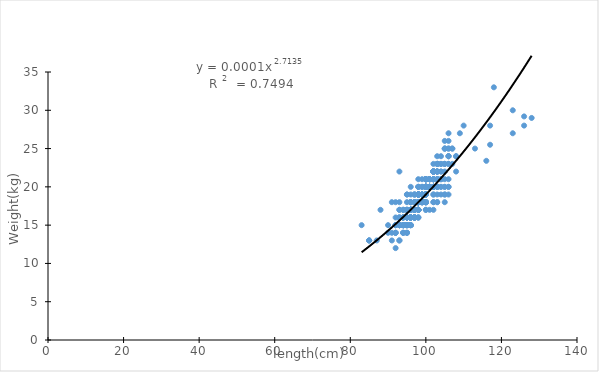
| Category | Series 0 |
|---|---|
| 92.0 | 12 |
| 91.0 | 13 |
| 93.0 | 13 |
| 87.0 | 13 |
| 85.0 | 13 |
| 85.0 | 13 |
| 85.0 | 13 |
| 93.0 | 13 |
| 91.0 | 14 |
| 92.0 | 14 |
| 90.0 | 14 |
| 92.0 | 14 |
| 92.0 | 14 |
| 94.0 | 14 |
| 95.0 | 14 |
| 95.0 | 14 |
| 94.0 | 14 |
| 95.0 | 14 |
| 94.0 | 14 |
| 83.0 | 15 |
| 93.0 | 15 |
| 95.0 | 15 |
| 95.0 | 15 |
| 94.0 | 15 |
| 96.0 | 15 |
| 96.0 | 15 |
| 94.0 | 15 |
| 93.0 | 15 |
| 92.0 | 15 |
| 90.0 | 15 |
| 93.0 | 15 |
| 92.0 | 15 |
| 93.0 | 15 |
| 94.0 | 15 |
| 96.0 | 15 |
| 93.0 | 15 |
| 93.0 | 15 |
| 92.0 | 15 |
| 94.0 | 15 |
| 93.0 | 15 |
| 93.0 | 15 |
| 94.0 | 15 |
| 92.0 | 15 |
| 94.0 | 15 |
| 95.0 | 15 |
| 94.0 | 15 |
| 94.0 | 15 |
| 94.0 | 15 |
| 96.0 | 15 |
| 95.0 | 15 |
| 95.0 | 15 |
| 95.0 | 15 |
| 96.0 | 15 |
| 95.0 | 15 |
| 94.0 | 15 |
| 95.0 | 15 |
| 95.0 | 15 |
| 94.0 | 15 |
| 96.0 | 15 |
| 95.0 | 15 |
| 95.0 | 15 |
| 95.0 | 15 |
| 94.0 | 15 |
| 94.0 | 15 |
| 95.0 | 15 |
| 95.0 | 15 |
| 97.0 | 16 |
| 98.0 | 16 |
| 92.0 | 16 |
| 94.0 | 16 |
| 96.0 | 16 |
| 94.0 | 16 |
| 95.0 | 16 |
| 93.0 | 16 |
| 93.0 | 16 |
| 98.0 | 16 |
| 94.0 | 16 |
| 95.0 | 16 |
| 93.0 | 16 |
| 96.0 | 16 |
| 97.0 | 16 |
| 95.0 | 16 |
| 94.0 | 16 |
| 97.0 | 16 |
| 94.0 | 16 |
| 97.0 | 16 |
| 96.0 | 16 |
| 97.0 | 16 |
| 96.0 | 16 |
| 95.0 | 16 |
| 98.0 | 16 |
| 96.0 | 16 |
| 95.0 | 16 |
| 95.0 | 16 |
| 96.0 | 16 |
| 97.0 | 16 |
| 96.0 | 16 |
| 94.0 | 16 |
| 95.0 | 16 |
| 96.0 | 16 |
| 96.0 | 16 |
| 95.0 | 16 |
| 97.0 | 16 |
| 96.0 | 16 |
| 96.0 | 16 |
| 96.0 | 16 |
| 95.0 | 16 |
| 96.0 | 16 |
| 96.0 | 16 |
| 97.0 | 16 |
| 96.0 | 16 |
| 96.0 | 16 |
| 96.0 | 16 |
| 95.0 | 16 |
| 96.0 | 16 |
| 96.0 | 16 |
| 88.0 | 17 |
| 98.0 | 17 |
| 100.0 | 17 |
| 98.0 | 17 |
| 96.0 | 17 |
| 98.0 | 17 |
| 97.0 | 17 |
| 93.0 | 17 |
| 97.0 | 17 |
| 94.0 | 17 |
| 95.0 | 17 |
| 95.0 | 17 |
| 98.0 | 17 |
| 96.0 | 17 |
| 100.0 | 17 |
| 97.0 | 17 |
| 98.0 | 17 |
| 101.0 | 17 |
| 102.0 | 17 |
| 98.0 | 17 |
| 94.0 | 17 |
| 95.0 | 17 |
| 94.0 | 17 |
| 93.0 | 17 |
| 98.0 | 17 |
| 96.0 | 17 |
| 97.0 | 17 |
| 97.0 | 17 |
| 97.0 | 17 |
| 96.0 | 17 |
| 96.0 | 17 |
| 97.0 | 17 |
| 96.0 | 17 |
| 95.0 | 17 |
| 98.0 | 17 |
| 97.0 | 17 |
| 98.0 | 17 |
| 97.0 | 17 |
| 98.0 | 17 |
| 96.0 | 17 |
| 96.0 | 17 |
| 97.0 | 17 |
| 97.0 | 17 |
| 97.0 | 17 |
| 97.0 | 17 |
| 96.0 | 17 |
| 97.0 | 17 |
| 96.0 | 17 |
| 97.0 | 17 |
| 96.0 | 17 |
| 97.0 | 17 |
| 97.0 | 17 |
| 96.0 | 17 |
| 95.0 | 17 |
| 96.0 | 17 |
| 95.0 | 17 |
| 98.0 | 17 |
| 96.0 | 17 |
| 97.0 | 17 |
| 96.0 | 17 |
| 96.0 | 17 |
| 97.0 | 17 |
| 97.0 | 17 |
| 98.0 | 17 |
| 96.0 | 17 |
| 97.0 | 17 |
| 98.0 | 17 |
| 96.0 | 17 |
| 97.0 | 17 |
| 97.0 | 17 |
| 97.0 | 17 |
| 96.0 | 17 |
| 97.0 | 17 |
| 96.0 | 17 |
| 98.0 | 17 |
| 97.0 | 17 |
| 97.0 | 17 |
| 97.0 | 17 |
| 97.0 | 17 |
| 97.0 | 17 |
| 96.0 | 17 |
| 96.0 | 17 |
| 97.0 | 17 |
| 97.0 | 18 |
| 91.0 | 18 |
| 102.0 | 18 |
| 100.0 | 18 |
| 100.0 | 18 |
| 97.0 | 18 |
| 96.0 | 18 |
| 100.0 | 18 |
| 100.0 | 18 |
| 98.0 | 18 |
| 92.0 | 18 |
| 98.0 | 18 |
| 102.0 | 18 |
| 100.0 | 18 |
| 98.0 | 18 |
| 103.0 | 18 |
| 105.0 | 18 |
| 97.0 | 18 |
| 98.0 | 18 |
| 100.0 | 18 |
| 103.0 | 18 |
| 95.0 | 18 |
| 100.0 | 18 |
| 98.0 | 18 |
| 96.0 | 18 |
| 93.0 | 18 |
| 96.0 | 18 |
| 97.0 | 18 |
| 100.0 | 18 |
| 98.0 | 18 |
| 99.0 | 18 |
| 100.0 | 18 |
| 100.0 | 18 |
| 99.0 | 18 |
| 100.0 | 18 |
| 98.0 | 18 |
| 99.0 | 18 |
| 98.0 | 18 |
| 98.0 | 18 |
| 98.0 | 18 |
| 99.0 | 18 |
| 99.0 | 18 |
| 98.0 | 18 |
| 98.0 | 18 |
| 99.0 | 18 |
| 98.0 | 18 |
| 99.0 | 18 |
| 98.0 | 18 |
| 98.0 | 18 |
| 99.0 | 18 |
| 98.0 | 18 |
| 98.0 | 18 |
| 97.0 | 18 |
| 98.0 | 18 |
| 98.0 | 18 |
| 98.0 | 18 |
| 97.0 | 18 |
| 96.0 | 18 |
| 97.0 | 18 |
| 98.0 | 18 |
| 98.0 | 18 |
| 99.0 | 18 |
| 99.0 | 18 |
| 98.0 | 18 |
| 98.0 | 18 |
| 99.0 | 18 |
| 98.0 | 18 |
| 98.0 | 18 |
| 98.0 | 18 |
| 98.0 | 18 |
| 98.0 | 18 |
| 99.0 | 18 |
| 97.0 | 18 |
| 98.0 | 18 |
| 98.0 | 18 |
| 98.0 | 18 |
| 98.0 | 18 |
| 98.0 | 18 |
| 99.0 | 18 |
| 97.0 | 18 |
| 98.0 | 18 |
| 97.0 | 18 |
| 98.0 | 18 |
| 98.0 | 18 |
| 98.0 | 18 |
| 98.0 | 18 |
| 98.0 | 18 |
| 102.0 | 19 |
| 105.0 | 19 |
| 100.0 | 19 |
| 100.0 | 19 |
| 98.0 | 19 |
| 96.0 | 19 |
| 104.0 | 19 |
| 100.0 | 19 |
| 106.0 | 19 |
| 98.0 | 19 |
| 100.0 | 19 |
| 102.0 | 19 |
| 105.0 | 19 |
| 100.0 | 19 |
| 98.0 | 19 |
| 103.0 | 19 |
| 98.0 | 19 |
| 95.0 | 19 |
| 95.0 | 19 |
| 97.0 | 19 |
| 97.0 | 19 |
| 97.0 | 19 |
| 100.0 | 19 |
| 100.0 | 19 |
| 100.0 | 19 |
| 100.0 | 19 |
| 98.0 | 19 |
| 100.0 | 19 |
| 100.0 | 19 |
| 100.0 | 19 |
| 100.0 | 19 |
| 100.0 | 19 |
| 100.0 | 19 |
| 98.0 | 19 |
| 100.0 | 19 |
| 99.0 | 19 |
| 98.0 | 19 |
| 99.0 | 19 |
| 98.0 | 19 |
| 100.0 | 19 |
| 98.0 | 19 |
| 98.0 | 19 |
| 99.0 | 19 |
| 99.0 | 19 |
| 99.0 | 19 |
| 98.0 | 19 |
| 98.0 | 19 |
| 99.0 | 19 |
| 100.0 | 19 |
| 100.0 | 19 |
| 100.0 | 19 |
| 100.0 | 19 |
| 100.0 | 19 |
| 99.0 | 19 |
| 100.0 | 19 |
| 100.0 | 19 |
| 100.0 | 19 |
| 100.0 | 19 |
| 100.0 | 19 |
| 100.0 | 19 |
| 99.0 | 19 |
| 99.0 | 19 |
| 98.0 | 19 |
| 98.0 | 19 |
| 99.0 | 19 |
| 98.0 | 19 |
| 99.0 | 19 |
| 103.0 | 20 |
| 100.0 | 20 |
| 106.0 | 20 |
| 102.0 | 20 |
| 104.0 | 20 |
| 100.0 | 20 |
| 102.0 | 20 |
| 96.0 | 20 |
| 98.0 | 20 |
| 105.0 | 20 |
| 101.0 | 20 |
| 102.0 | 20 |
| 106.0 | 20 |
| 100.0 | 20 |
| 101.0 | 20 |
| 105.0 | 20 |
| 103.0 | 20 |
| 101.0 | 20 |
| 100.0 | 20 |
| 98.0 | 20 |
| 102.0 | 20 |
| 98.0 | 20 |
| 101.0 | 20 |
| 104.0 | 20 |
| 100.0 | 20 |
| 102.0 | 20 |
| 103.0 | 20 |
| 102.0 | 20 |
| 102.0 | 20 |
| 102.0 | 20 |
| 101.0 | 20 |
| 100.0 | 20 |
| 102.0 | 20 |
| 103.0 | 20 |
| 100.0 | 20 |
| 99.0 | 20 |
| 100.0 | 20 |
| 99.0 | 20 |
| 100.0 | 20 |
| 100.0 | 20 |
| 100.0 | 20 |
| 101.0 | 20 |
| 100.0 | 20 |
| 100.0 | 20 |
| 100.0 | 20 |
| 101.0 | 20 |
| 100.0 | 20 |
| 100.0 | 20 |
| 101.0 | 20 |
| 100.0 | 20 |
| 101.0 | 20 |
| 100.0 | 20 |
| 100.0 | 20 |
| 100.0 | 20 |
| 102.0 | 20 |
| 100.0 | 20 |
| 100.0 | 20 |
| 100.0 | 20 |
| 101.0 | 20 |
| 100.0 | 20 |
| 101.0 | 20 |
| 99.0 | 20 |
| 100.0 | 20 |
| 100.0 | 20 |
| 100.0 | 20 |
| 100.0 | 20 |
| 99.0 | 21 |
| 98.0 | 21 |
| 104.0 | 21 |
| 106.0 | 21 |
| 100.0 | 21 |
| 103.0 | 21 |
| 104.0 | 21 |
| 100.0 | 21 |
| 102.0 | 21 |
| 100.0 | 21 |
| 102.0 | 21 |
| 100.0 | 21 |
| 100.0 | 21 |
| 100.0 | 21 |
| 100.0 | 21 |
| 102.0 | 21 |
| 105.0 | 21 |
| 103.0 | 21 |
| 102.0 | 21 |
| 100.0 | 21 |
| 104.0 | 21 |
| 103.0 | 21 |
| 102.0 | 21 |
| 103.0 | 21 |
| 103.0 | 21 |
| 102.0 | 21 |
| 103.0 | 21 |
| 102.0 | 21 |
| 101.0 | 21 |
| 100.0 | 21 |
| 101.0 | 21 |
| 101.0 | 21 |
| 102.0 | 21 |
| 101.0 | 21 |
| 102.0 | 21 |
| 101.0 | 21 |
| 101.0 | 21 |
| 102.0 | 21 |
| 100.0 | 21 |
| 100.0 | 21 |
| 101.0 | 21 |
| 101.0 | 21 |
| 100.0 | 21 |
| 93.0 | 22 |
| 108.0 | 22 |
| 104.0 | 22 |
| 102.0 | 22 |
| 103.0 | 22 |
| 103.0 | 22 |
| 104.0 | 22 |
| 102.0 | 22 |
| 105.0 | 22 |
| 103.0 | 22 |
| 103.0 | 22 |
| 103.0 | 22 |
| 102.0 | 22 |
| 102.0 | 22 |
| 103.0 | 22 |
| 102.0 | 22 |
| 102.0 | 22 |
| 102.0 | 22 |
| 102.0 | 22 |
| 102.0 | 22 |
| 102.0 | 22 |
| 102.0 | 22 |
| 105.0 | 23 |
| 106.0 | 23 |
| 105.0 | 23 |
| 104.0 | 23 |
| 102.0 | 23 |
| 105.0 | 23 |
| 103.0 | 23 |
| 106.0 | 23 |
| 107.0 | 23 |
| 104.0 | 23 |
| 103.0 | 23 |
| 104.0 | 23 |
| 103.0 | 23 |
| 103.0 | 23 |
| 103.0 | 23 |
| 116.0 | 23.4 |
| 106.0 | 24 |
| 108.0 | 24 |
| 106.0 | 24 |
| 108.0 | 24 |
| 103.0 | 24 |
| 106.0 | 24 |
| 104.0 | 24 |
| 113.0 | 25 |
| 107.0 | 25 |
| 107.0 | 25 |
| 106.0 | 25 |
| 106.0 | 25 |
| 105.0 | 25 |
| 105.0 | 25 |
| 105.0 | 25 |
| 117.0 | 25.5 |
| 106.0 | 26 |
| 105.0 | 26 |
| 123.0 | 27 |
| 109.0 | 27 |
| 106.0 | 27 |
| 126.0 | 28 |
| 117.0 | 28 |
| 110.0 | 28 |
| 128.0 | 29 |
| 126.0 | 29.2 |
| 123.0 | 30 |
| 118.0 | 33 |